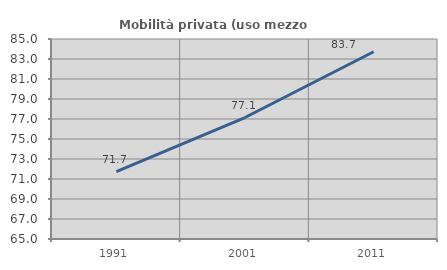
| Category | Mobilità privata (uso mezzo privato) |
|---|---|
| 1991.0 | 71.743 |
| 2001.0 | 77.148 |
| 2011.0 | 83.725 |